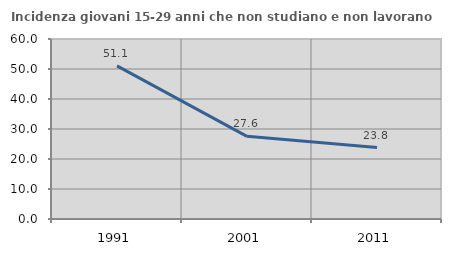
| Category | Incidenza giovani 15-29 anni che non studiano e non lavorano  |
|---|---|
| 1991.0 | 51.056 |
| 2001.0 | 27.559 |
| 2011.0 | 23.827 |